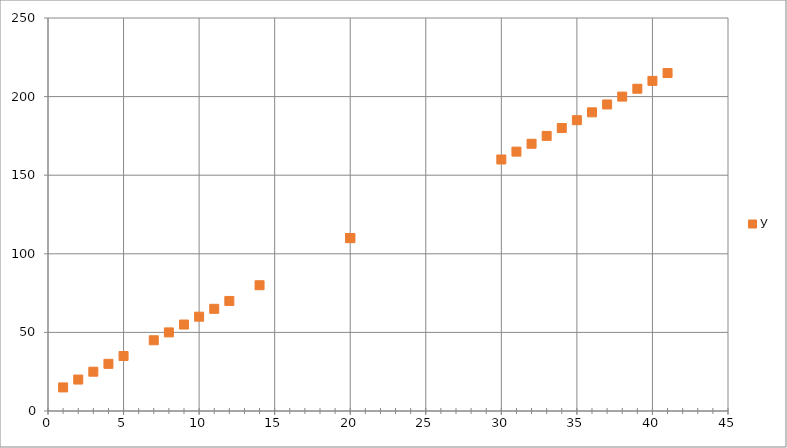
| Category | У |
|---|---|
| 1.0 | 15 |
| 2.0 | 20 |
| 3.0 | 25 |
| 4.0 | 30 |
| 5.0 | 35 |
| 20.0 | 110 |
| 7.0 | 45 |
| 8.0 | 50 |
| 9.0 | 55 |
| 10.0 | 60 |
| 11.0 | 65 |
| 12.0 | 70 |
| 20.0 | 110 |
| 14.0 | 80 |
| 30.0 | 160 |
| 31.0 | 165 |
| 32.0 | 170 |
| 33.0 | 175 |
| 34.0 | 180 |
| 35.0 | 185 |
| 36.0 | 190 |
| 37.0 | 195 |
| 38.0 | 200 |
| 39.0 | 205 |
| 40.0 | 210 |
| 41.0 | 215 |